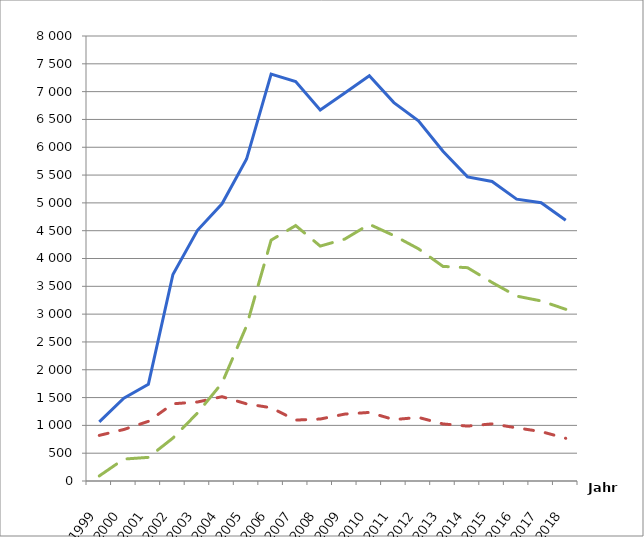
| Category | insgesamt | Unternehmen1 | Verbraucher |
|---|---|---|---|
| 1999.0 | 1064 | 820 | 91 |
| 2000.0 | 1488 | 926 | 394 |
| 2001.0 | 1737 | 1072 | 425 |
| 2002.0 | 3712 | 1388 | 772 |
| 2003.0 | 4507 | 1420 | 1222 |
| 2004.0 | 4984 | 1516 | 1761 |
| 2005.0 | 5788 | 1387 | 2788 |
| 2006.0 | 7315 | 1317 | 4330 |
| 2007.0 | 7181 | 1095 | 4592 |
| 2008.0 | 6671 | 1114 | 4223 |
| 2009.0 | 6976 | 1203 | 4349 |
| 2010.0 | 7287 | 1233 | 4615 |
| 2011.0 | 6803 | 1104 | 4412 |
| 2012.0 | 6477 | 1143 | 4175 |
| 2013.0 | 5928 | 1026 | 3858 |
| 2014.0 | 5467 | 987 | 3835 |
| 2015.0 | 5384 | 1027 | 3569 |
| 2016.0 | 5067 | 956 | 3324 |
| 2017.0 | 5003 | 888 | 3237 |
| 2018.0 | 4688 | 768 | 3087 |